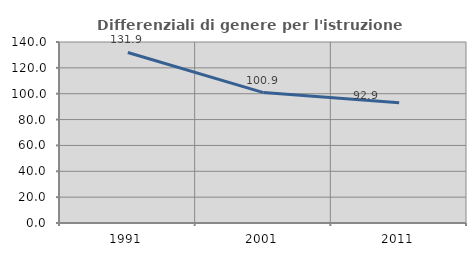
| Category | Differenziali di genere per l'istruzione superiore |
|---|---|
| 1991.0 | 131.879 |
| 2001.0 | 100.878 |
| 2011.0 | 92.94 |